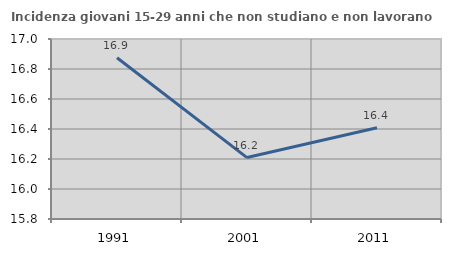
| Category | Incidenza giovani 15-29 anni che non studiano e non lavorano  |
|---|---|
| 1991.0 | 16.875 |
| 2001.0 | 16.209 |
| 2011.0 | 16.408 |